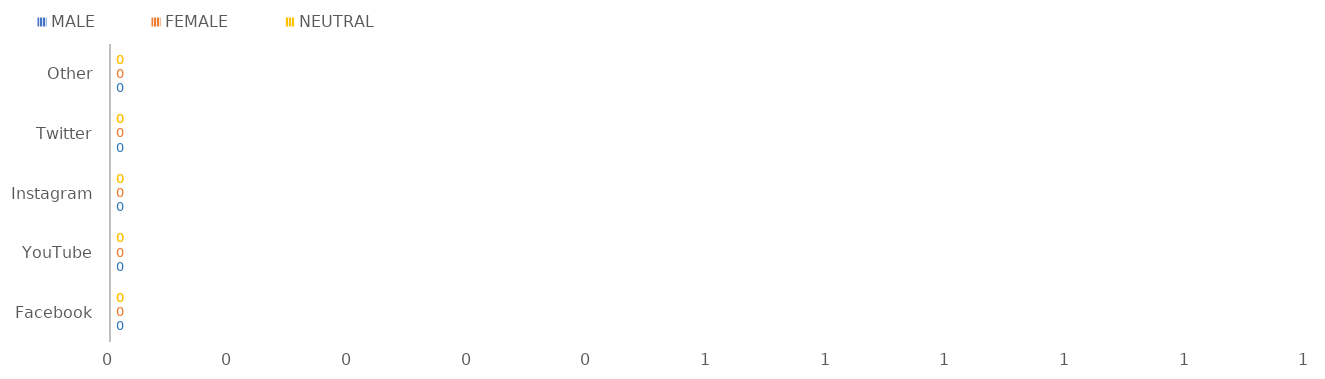
| Category | MALE | FEMALE | NEUTRAL |
|---|---|---|---|
| Facebook | 0 | 0 | 0 |
| YouTube | 0 | 0 | 0 |
| Instagram | 0 | 0 | 0 |
| Twitter | 0 | 0 | 0 |
| Other | 0 | 0 | 0 |